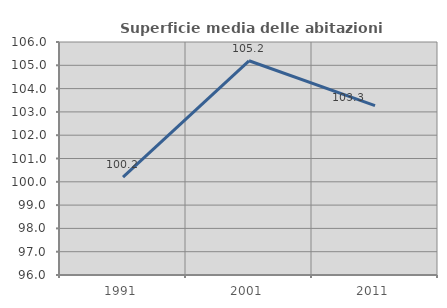
| Category | Superficie media delle abitazioni occupate |
|---|---|
| 1991.0 | 100.197 |
| 2001.0 | 105.194 |
| 2011.0 | 103.267 |